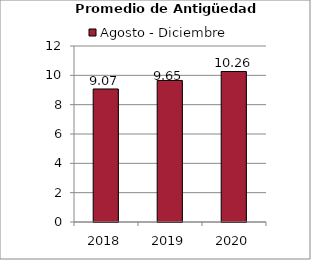
| Category | Agosto - Diciembre |
|---|---|
| 2018.0 | 9.07 |
| 2019.0 | 9.65 |
| 2020.0 | 10.26 |